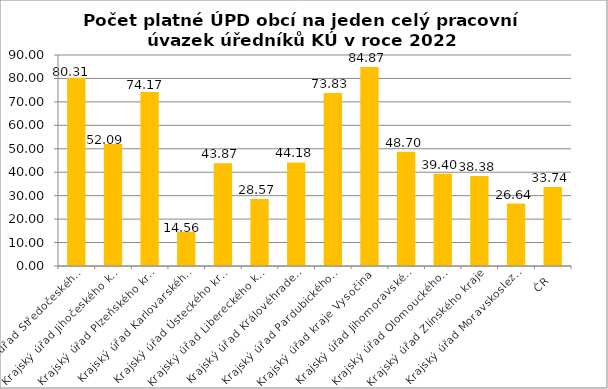
| Category | Počet platné ÚPD obcí na jeden celý pracovní úvazek úředníků KÚ |
|---|---|
| Krajský úřad Středočeského kraje | 80.31 |
| Krajský úřad Jihočeského kraje | 52.09 |
| Krajský úřad Plzeňského kraje | 74.17 |
| Krajský úřad Karlovarského kraje | 14.56 |
| Krajský úřad Ústeckého kraje | 43.87 |
| Krajský úřad Libereckého kraje | 28.57 |
| Krajský úřad Královéhradeckého kraje | 44.18 |
| Krajský úřad Pardubického kraje | 73.83 |
| Krajský úřad kraje Vysočina | 84.87 |
| Krajský úřad Jihomoravského kraje | 48.7 |
| Krajský úřad Olomouckého kraje | 39.4 |
| Krajský úřad Zlínského kraje | 38.38 |
| Krajský úřad Moravskoslezského kraje | 26.64 |
| ČR | 33.74 |